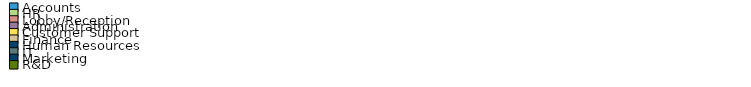
| Category | Series 0 | Monday |
|---|---|---|
| Accounts |  | 1 |
| HR |  | 1 |
| Lobby/Reception |  | 0 |
| Administration |  | 0 |
| Customer Support |  | 1 |
| Finance |  | 0 |
| Human Resources |  | 0 |
| IT |  | 0 |
| Marketing |  | 0 |
| R&D |  | 0 |
| Sales |  | 0 |